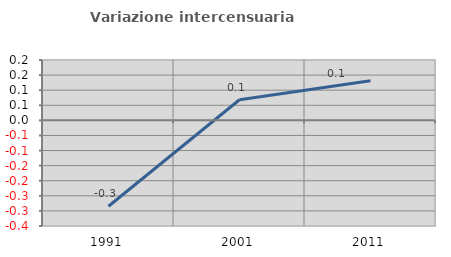
| Category | Variazione intercensuaria annua |
|---|---|
| 1991.0 | -0.285 |
| 2001.0 | 0.068 |
| 2011.0 | 0.131 |